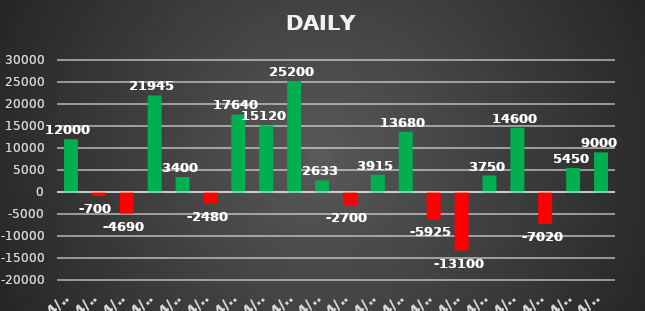
| Category | Series 0 |
|---|---|
| 2023-04-03 | 12000 |
| 2023-04-05 | -700 |
| 2023-04-05 | -4690 |
| 2023-04-06 | 21945 |
| 2023-04-10 | 3400 |
| 2023-04-11 | -2480 |
| 2023-04-11 | 17640 |
| 2023-04-12 | 15120 |
| 2023-04-13 | 25200 |
| 2023-04-17 | 2632.5 |
| 2023-04-17 | -2700 |
| 2023-04-18 | 3915 |
| 2023-04-19 | 13680 |
| 2023-04-20 | -5925 |
| 2023-04-21 | -13100 |
| 2023-04-24 | 3750 |
| 2023-04-25 | 14600 |
| 2023-04-26 | -7020 |
| 2023-04-27 | 5450 |
| 2023-04-28 | 9000 |